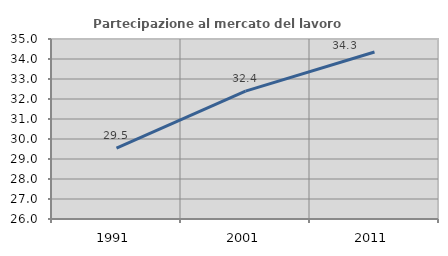
| Category | Partecipazione al mercato del lavoro  femminile |
|---|---|
| 1991.0 | 29.546 |
| 2001.0 | 32.392 |
| 2011.0 | 34.348 |